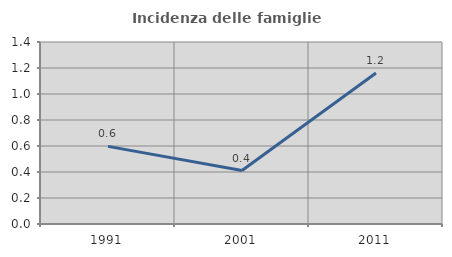
| Category | Incidenza delle famiglie numerose |
|---|---|
| 1991.0 | 0.597 |
| 2001.0 | 0.412 |
| 2011.0 | 1.161 |